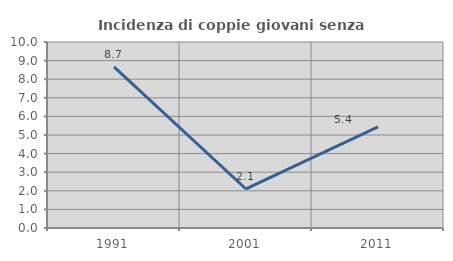
| Category | Incidenza di coppie giovani senza figli |
|---|---|
| 1991.0 | 8.667 |
| 2001.0 | 2.098 |
| 2011.0 | 5.442 |